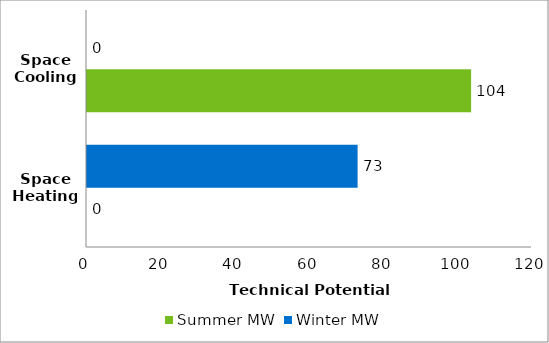
| Category | Summer MW | Winter MW |
|---|---|---|
| Space Heating | 0 | 72.974 |
| Space Cooling | 103.582 | 0 |